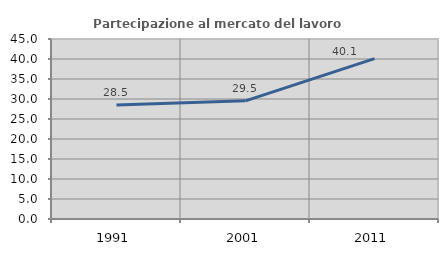
| Category | Partecipazione al mercato del lavoro  femminile |
|---|---|
| 1991.0 | 28.507 |
| 2001.0 | 29.549 |
| 2011.0 | 40.08 |